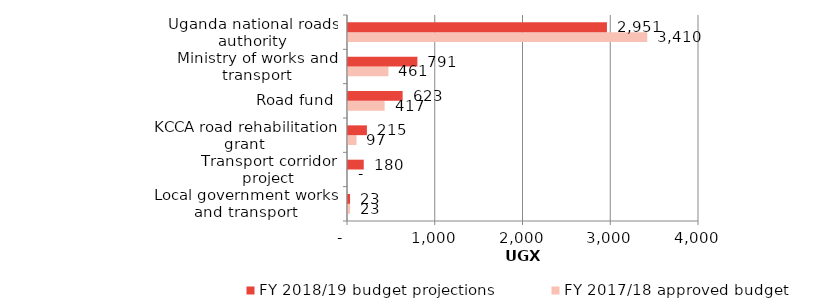
| Category | FY 2017/18 approved budget | FY 2018/19 budget projections |
|---|---|---|
| Local government works and transport | 23.44 | 23.44 |
| Transport corridor project | 0 | 179.51 |
| KCCA road rehabilitation grant | 96.69 | 215.45 |
| Road fund | 417.39 | 622.52 |
| Ministry of works and transport | 460.76 | 790.6 |
| Uganda national roads authority | 3410.08 | 2950.9 |